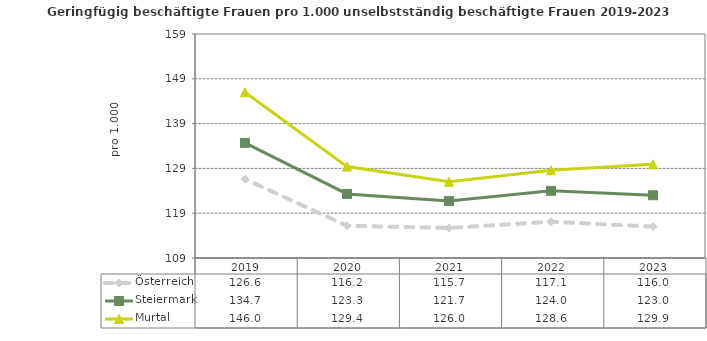
| Category | Österreich | Steiermark | Murtal |
|---|---|---|---|
| 2023.0 | 116 | 123 | 129.9 |
| 2022.0 | 117.1 | 124 | 128.6 |
| 2021.0 | 115.7 | 121.7 | 126 |
| 2020.0 | 116.2 | 123.3 | 129.4 |
| 2019.0 | 126.6 | 134.7 | 146 |